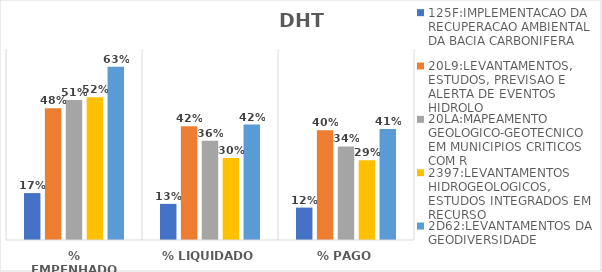
| Category | 125F:IMPLEMENTACAO DA RECUPERACAO AMBIENTAL DA BACIA CARBONIFERA | 20L9:LEVANTAMENTOS, ESTUDOS, PREVISAO E ALERTA DE EVENTOS HIDROLO | 20LA:MAPEAMENTO GEOLOGICO-GEOTECNICO EM MUNICIPIOS CRITICOS COM R | 2397:LEVANTAMENTOS HIDROGEOLOGICOS, ESTUDOS INTEGRADOS EM RECURSO | 2D62:LEVANTAMENTOS DA GEODIVERSIDADE |
|---|---|---|---|---|---|
| % EMPENHADO | 0.172 | 0.482 | 0.513 | 0.523 | 0.635 |
| % LIQUIDADO | 0.132 | 0.416 | 0.363 | 0.301 | 0.423 |
| % PAGO | 0.119 | 0.402 | 0.343 | 0.292 | 0.407 |